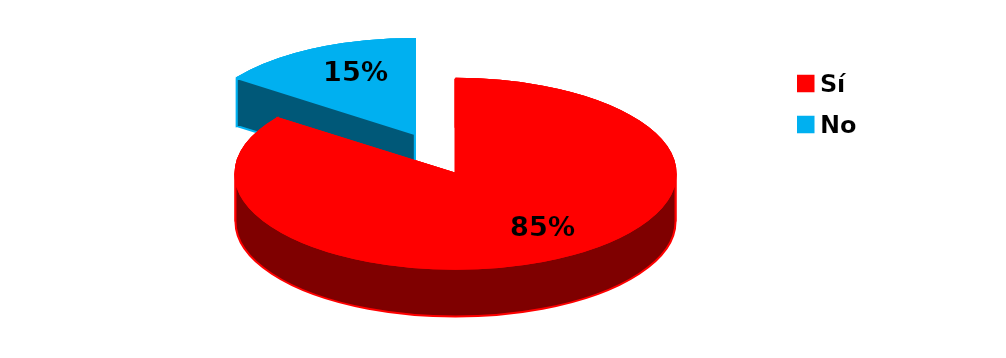
| Category | Series 0 |
|---|---|
| Sí | 17 |
| No | 3 |